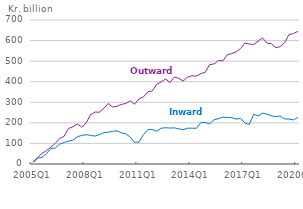
| Category | Inward | Outward |
|---|---|---|
| 2005Q1 | 7.1 | 10.9 |
| 2005Q2 | 28.5 | 31.4 |
| 2005Q3 | 31.8 | 52.1 |
| 2005Q4 | 51 | 65.2 |
| 2006Q1 | 75.1 | 82 |
| 2006Q2 | 77.9 | 100.6 |
| 2006Q3 | 96.3 | 123.9 |
| 2006Q4 | 104.3 | 134.1 |
| 2007Q1 | 111.9 | 173 |
| 2007Q2 | 115.7 | 180.4 |
| 2007Q3 | 132.6 | 195.1 |
| 2007Q4 | 139.1 | 179.1 |
| 2008Q1 | 142.6 | 198.9 |
| 2008Q2 | 138.9 | 240.3 |
| 2008Q3 | 135.8 | 252.4 |
| 2008Q4 | 142.9 | 251.9 |
| 2009Q1 | 152.4 | 270.5 |
| 2009Q2 | 154.6 | 294.1 |
| 2009Q3 | 158.8 | 277 |
| 2009Q4 | 161.4 | 280.8 |
| 2010Q1 | 151.1 | 289.4 |
| 2010Q2 | 147.2 | 294.4 |
| 2010Q3 | 130.5 | 307.2 |
| 2010Q4 | 105.4 | 290.5 |
| 2011Q1 | 107.2 | 316.6 |
| 2011Q2 | 143.3 | 326.3 |
| 2011Q3 | 167.7 | 350.7 |
| 2011Q4 | 168.2 | 355.2 |
| 2012Q1 | 159.5 | 387.8 |
| 2012Q2 | 174 | 398.7 |
| 2012Q3 | 176.1 | 413.6 |
| 2012Q4 | 174.9 | 395.2 |
| 2013Q1 | 175.5 | 423.1 |
| 2013Q2 | 170.8 | 416.3 |
| 2013Q3 | 166.8 | 403.1 |
| 2013Q4 | 174.2 | 422.1 |
| 2014Q1 | 174.4 | 429.3 |
| 2014Q2 | 173.4 | 427.2 |
| 2014Q3 | 201.5 | 439.2 |
| 2014Q4 | 201.7 | 446 |
| 2015Q1 | 194.9 | 483 |
| 2015Q2 | 214.9 | 486.5 |
| 2015Q3 | 220.6 | 502.9 |
| 2015Q4 | 228 | 501.2 |
| 2016Q1 | 226.2 | 531.2 |
| 2016Q2 | 225.3 | 537 |
| 2016Q3 | 218.1 | 544.4 |
| 2016Q4 | 222.5 | 561 |
| 2017Q1 | 199.3 | 587.7 |
| 2017Q2 | 192.3 | 583.3 |
| 2017Q3 | 242 | 580.7 |
| 2017Q4 | 234.1 | 597.6 |
| 2018Q1 | 247 | 612.8 |
| 2018Q2 | 242.5 | 587.8 |
| 2018Q3 | 234.4 | 584.8 |
| 2018Q4 | 230.1 | 565.3 |
| 2019Q1 | 233.1 | 570.7 |
| 2019Q2 | 219.1 | 589.6 |
| 2019Q3 | 218.6 | 629.6 |
| 2019Q4 | 214.2 | 633.9 |
| 2020Q1 | 226.5 | 644.9 |